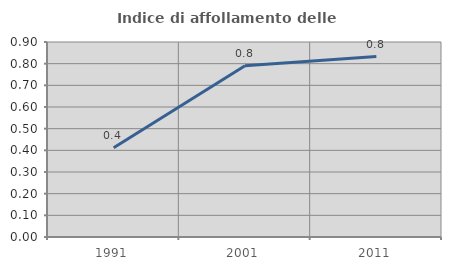
| Category | Indice di affollamento delle abitazioni  |
|---|---|
| 1991.0 | 0.412 |
| 2001.0 | 0.791 |
| 2011.0 | 0.833 |